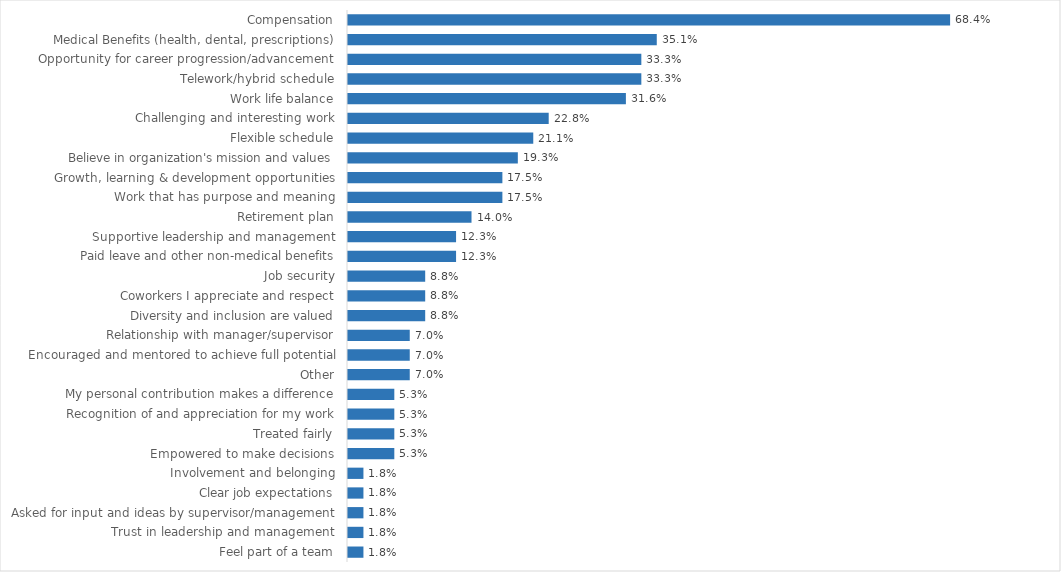
| Category | Attorney General |
|---|---|
| Compensation | 0.684 |
| Medical Benefits (health, dental, prescriptions) | 0.351 |
| Opportunity for career progression/advancement | 0.333 |
| Telework/hybrid schedule | 0.333 |
| Work life balance | 0.316 |
| Challenging and interesting work | 0.228 |
| Flexible schedule | 0.211 |
| Believe in organization's mission and values | 0.193 |
| Growth, learning & development opportunities | 0.175 |
| Work that has purpose and meaning | 0.175 |
| Retirement plan | 0.14 |
| Supportive leadership and management | 0.123 |
| Paid leave and other non-medical benefits | 0.123 |
| Job security | 0.088 |
| Coworkers I appreciate and respect | 0.088 |
| Diversity and inclusion are valued | 0.088 |
| Relationship with manager/supervisor | 0.07 |
| Encouraged and mentored to achieve full potential | 0.07 |
| Other | 0.07 |
| My personal contribution makes a difference | 0.053 |
| Recognition of and appreciation for my work | 0.053 |
| Treated fairly | 0.053 |
| Empowered to make decisions | 0.053 |
| Involvement and belonging | 0.018 |
| Clear job expectations | 0.018 |
| Asked for input and ideas by supervisor/management | 0.018 |
| Trust in leadership and management | 0.018 |
| Feel part of a team | 0.018 |